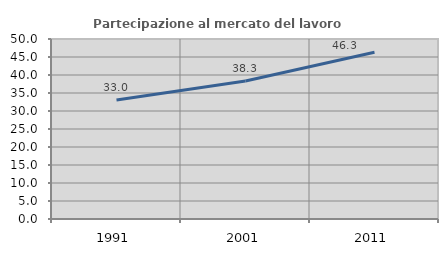
| Category | Partecipazione al mercato del lavoro  femminile |
|---|---|
| 1991.0 | 33.036 |
| 2001.0 | 38.321 |
| 2011.0 | 46.322 |